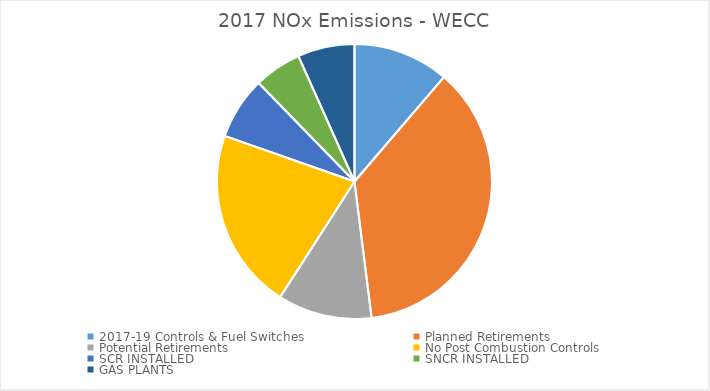
| Category | Series 0 | Series 1 |
|---|---|---|
| 2017-19 Controls & Fuel Switches | 21373 | 0.113 |
| Planned Retirements | 69700.977 | 0.367 |
| Potential Retirements | 21024.874 | 0.111 |
| No Post Combustion Controls | 40375.181 | 0.213 |
| SCR INSTALLED | 13914.408 | 0.073 |
| SNCR INSTALLED | 10611.608 | 0.056 |
| GAS PLANTS | 12693.554 | 0.067 |